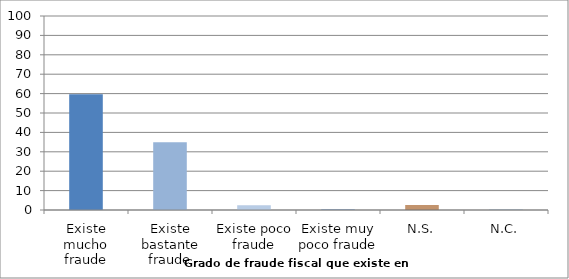
| Category | Series 0 |
|---|---|
| Existe mucho fraude | 59.66 |
| Existe bastante fraude | 34.913 |
| Existe poco fraude | 2.471 |
| Existe muy poco fraude | 0.284 |
| N.S. | 2.552 |
| N.C. | 0.122 |